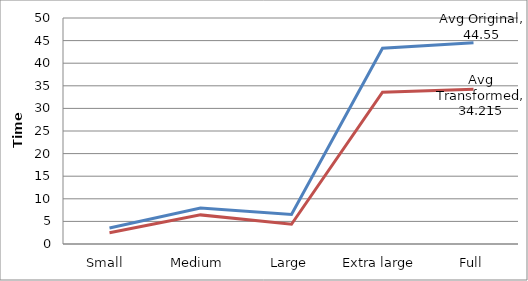
| Category | Avg Original | Avg Transformed |
|---|---|---|
| Small  | 3.546 | 2.489 |
| Medium | 7.938 | 6.441 |
| Large | 6.53 | 4.37 |
| Extra large | 43.299 | 33.592 |
| Full | 44.55 | 34.215 |